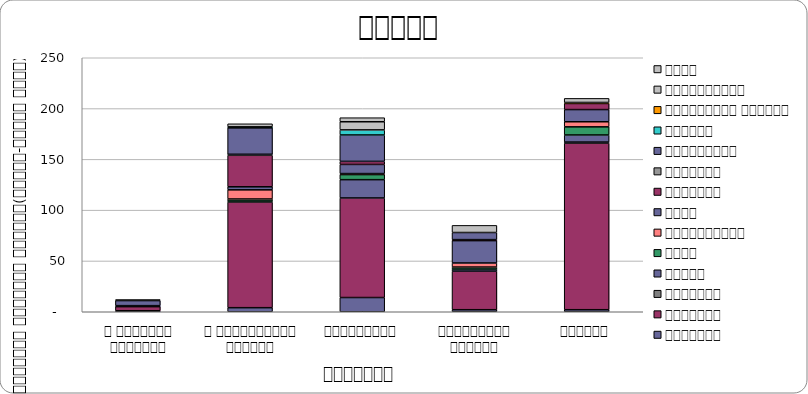
| Category | सुरक्षा | राजनीति | आन्दोलन | न्याय | शासन | अर्थतन्त्र | समाज | कुटनीति | वातावरण | स्वास्थ्य  | शिक्षा | प्राकृतिक प्रकोप | भ्रष्टाचार | अन्य |
|---|---|---|---|---|---|---|---|---|---|---|---|---|---|---|
| द हिमालयन टाइम्स् | 1 | 4 | 0 | 1 | 0 | 0 | 0 | 0 | 0 | 5 | 0 | 0 | 0 | 1 |
| द काठमाण्डौं पोस्ट् | 4 | 104 | 1 | 0 | 2 | 9 | 3 | 31 | 1 | 26 | 1 | 0 | 0 | 3 |
| कान्तिपुर | 14 | 98 | 0 | 18 | 5 | 1 | 9 | 3 | 0 | 26 | 5 | 0 | 8 | 4 |
| अन्नपूर्ण पोस्ट् | 2 | 38 | 0 | 2 | 2 | 4 | 22 | 1 | 0 | 7 | 0 | 0 | 7 | 0 |
| नागरिक | 2 | 164 | 1 | 7 | 8 | 5 | 12 | 6 | 0 | 0 | 0 | 1 | 4 | 0 |